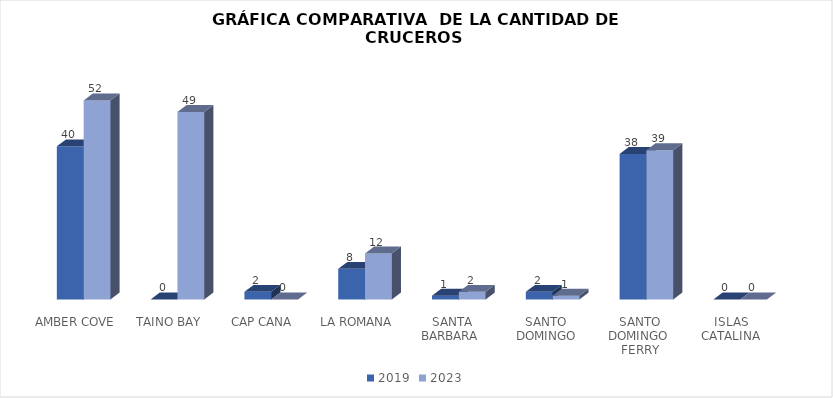
| Category | 2019 | 2023 |
|---|---|---|
| AMBER COVE | 40 | 52 |
| TAINO BAY | 0 | 49 |
| CAP CANA | 2 | 0 |
| LA ROMANA | 8 | 12 |
| SANTA BARBARA  | 1 | 2 |
| SANTO DOMINGO | 2 | 1 |
| SANTO DOMINGO  FERRY | 38 | 39 |
| ISLAS  CATALINA  | 0 | 0 |